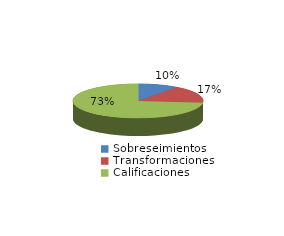
| Category | Series 0 |
|---|---|
| Sobreseimientos | 338 |
| Transformaciones | 566 |
| Calificaciones | 2470 |